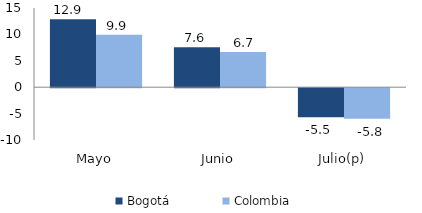
| Category | Bogotá | Colombia |
|---|---|---|
| Mayo | 12.86 | 9.95 |
| Junio | 7.583 | 6.675 |
| Julio(p) | -5.492 | -5.77 |